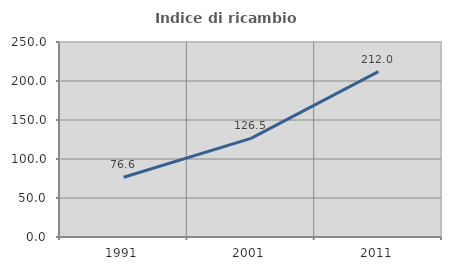
| Category | Indice di ricambio occupazionale  |
|---|---|
| 1991.0 | 76.587 |
| 2001.0 | 126.486 |
| 2011.0 | 211.968 |